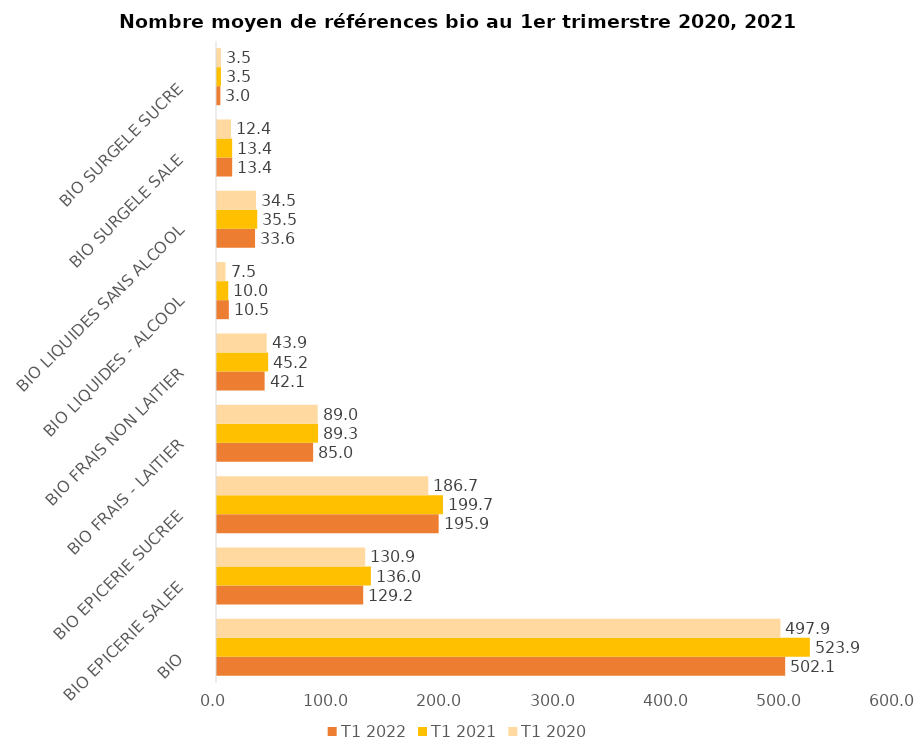
| Category | T1 2022 | T1 2021 | T1 2020 |
|---|---|---|---|
| BIO | 502.069 | 523.887 | 497.857 |
| BIO EPICERIE SALEE | 129.192 | 135.97 | 130.937 |
| BIO EPICERIE SUCREE | 195.878 | 199.682 | 186.693 |
| BIO FRAIS - LAITIER | 84.968 | 89.317 | 88.961 |
| BIO FRAIS NON LAITIER | 42.081 | 45.196 | 43.936 |
| BIO LIQUIDES - ALCOOL | 10.457 | 9.959 | 7.527 |
| BIO LIQUIDES SANS ALCOOL | 33.618 | 35.549 | 34.453 |
| BIO SURGELE SALE | 13.411 | 13.394 | 12.408 |
| BIO SURGELE SUCRE | 2.965 | 3.493 | 3.463 |